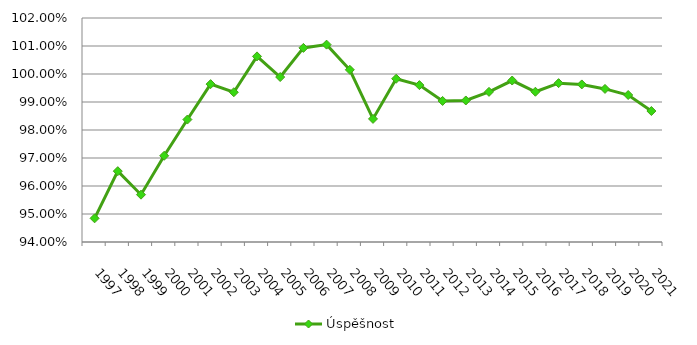
| Category | Úspěšnost |
|---|---|
| 1997.0 | 0.948 |
| 1998.0 | 0.965 |
| 1999.0 | 0.957 |
| 2000.0 | 0.971 |
| 2001.0 | 0.984 |
| 2002.0 | 0.996 |
| 2003.0 | 0.993 |
| 2004.0 | 1.006 |
| 2005.0 | 0.999 |
| 2006.0 | 1.009 |
| 2007.0 | 1.01 |
| 2008.0 | 1.002 |
| 2009.0 | 0.984 |
| 2010.0 | 0.998 |
| 2011.0 | 0.996 |
| 2012.0 | 0.99 |
| 2013.0 | 0.991 |
| 2014.0 | 0.994 |
| 2015.0 | 0.998 |
| 2016.0 | 0.994 |
| 2017.0 | 0.997 |
| 2018.0 | 0.996 |
| 2019.0 | 0.995 |
| 2020.0 | 0.992 |
| 2021.0 | 0.987 |